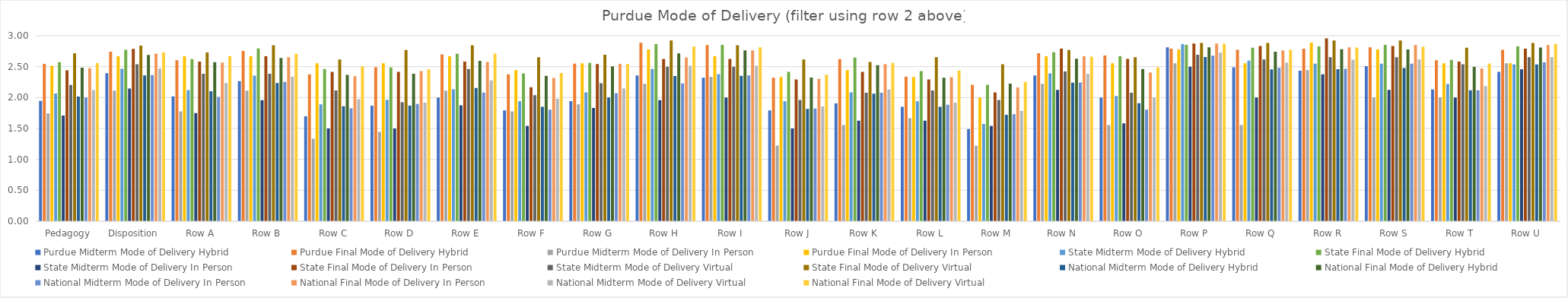
| Category | Purdue | State | National |
|---|---|---|---|
| Pedagogy | 2.513 | 2.716 | 2.558 |
| Disposition | 2.667 | 2.841 | 2.73 |
| Row A | 2.667 | 2.731 | 2.67 |
| Row B | 2.667 | 2.846 | 2.706 |
| Row C | 2.556 | 2.615 | 2.506 |
| Row D | 2.556 | 2.769 | 2.46 |
| Row E | 2.667 | 2.846 | 2.712 |
| Row F | 2.444 | 2.654 | 2.397 |
| Row G | 2.556 | 2.692 | 2.546 |
| Row H | 2.778 | 2.923 | 2.823 |
| Row I | 2.667 | 2.846 | 2.813 |
| Row J | 2.333 | 2.615 | 2.371 |
| Row K | 2.444 | 2.577 | 2.561 |
| Row L | 2.333 | 2.654 | 2.439 |
| Row M | 2 | 2.538 | 2.254 |
| Row N | 2.667 | 2.769 | 2.663 |
| Row O | 2.556 | 2.654 | 2.488 |
| Row P | 2.778 | 2.885 | 2.87 |
| Row Q | 2.556 | 2.885 | 2.771 |
| Row R | 2.889 | 2.923 | 2.81 |
| Row S | 2.778 | 2.923 | 2.821 |
| Row T | 2.556 | 2.808 | 2.551 |
| Row U | 2.556 | 2.885 | 2.868 |